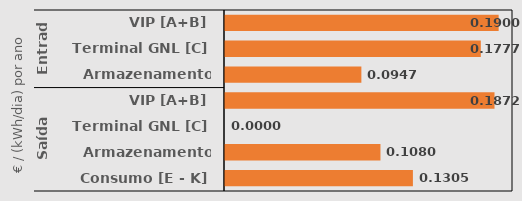
| Category | Series 0 |
|---|---|
| 0 | 0.19 |
| 1 | 0.178 |
| 2 | 0.095 |
| 3 | 0.187 |
| 4 | 0 |
| 5 | 0.108 |
| 6 | 0.13 |